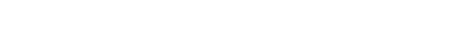
| Category | oui | non | NC |
|---|---|---|---|
| 0 | 0 | 0 | 0 |